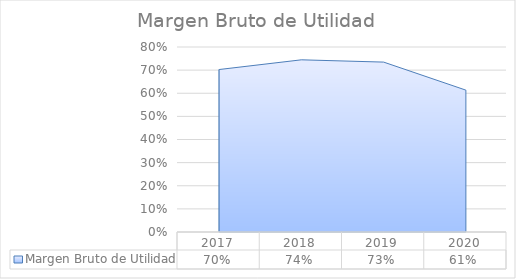
| Category | Margen Bruto de Utilidad |
|---|---|
| 2017.0 | 0.703 |
| 2018.0 | 0.745 |
| 2019.0 | 0.735 |
| 2020.0 | 0.614 |